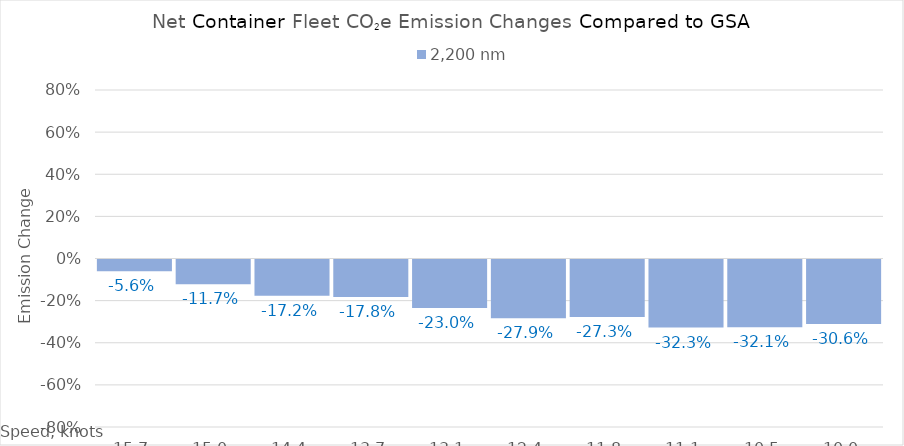
| Category | 2,200 |
|---|---|
| 15.65 | -0.056 |
| 15.0 | -0.117 |
| 14.35 | -0.172 |
| 13.7 | -0.178 |
| 13.049999999999999 | -0.23 |
| 12.399999999999999 | -0.279 |
| 11.749999999999998 | -0.273 |
| 11.099999999999998 | -0.323 |
| 10.449999999999998 | -0.321 |
| 10.0 | -0.306 |